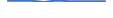
| Category | Series 0 |
|---|---|
| 0 | 3 |
| 1 | 3 |
| 2 | 3 |
| 3 | 0 |
| 4 | 4 |
| 5 | 2 |
| 6 | 2 |
| 7 | 2 |
| 8 | 2 |